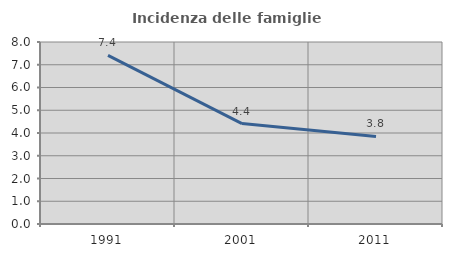
| Category | Incidenza delle famiglie numerose |
|---|---|
| 1991.0 | 7.41 |
| 2001.0 | 4.414 |
| 2011.0 | 3.849 |